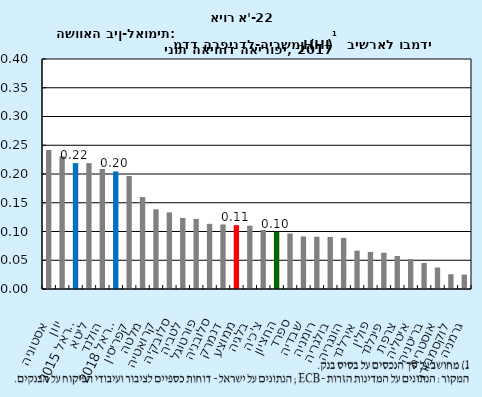
| Category | Series 1 |
|---|---|
| אסטוניה | 0.242 |
| יוון | 0.231 |
| ישראל 2015 | 0.219 |
| ליטא | 0.219 |
| הולנד | 0.209 |
| ישראל 2018 | 0.204 |
| קפריסין | 0.196 |
| מלטה | 0.16 |
| קרואטיה | 0.139 |
| סלובקיה | 0.133 |
| לטביה | 0.124 |
| פורטוגל | 0.122 |
| סלובניה | 0.113 |
| דנמרק | 0.112 |
| ממוצע | 0.111 |
| בלגיה | 0.11 |
| צ'כיה | 0.103 |
| החציון | 0.1 |
| ספרד | 0.096 |
| שבדיה | 0.091 |
| רומניה | 0.091 |
| בולגריה | 0.091 |
| הונגריה | 0.089 |
| אירלנד | 0.067 |
| פולין | 0.064 |
| פינלנד | 0.063 |
| צרפת | 0.057 |
| איטליה | 0.052 |
| בריטניה | 0.045 |
| אוסטריה | 0.038 |
| לוקסמבורג | 0.026 |
| גרמניה | 0.025 |